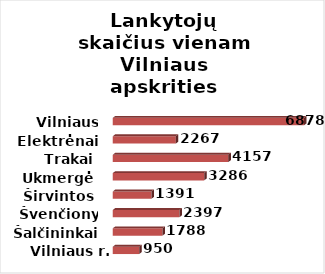
| Category | Series 0 |
|---|---|
| Vilniaus r. | 950 |
| Šalčininkai | 1788 |
| Švenčionys | 2397 |
| Širvintos | 1391 |
| Ukmergė | 3286 |
| Trakai | 4157 |
| Elektrėnai | 2267 |
| Vilniaus m. | 6878 |